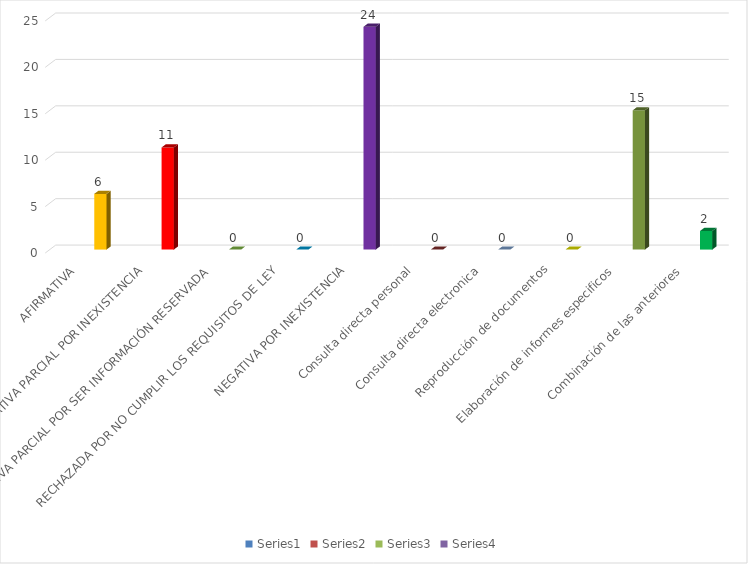
| Category | Series 0 | Series 1 | Series 2 | Series 3 |
|---|---|---|---|---|
| AFIRMATIVA |  |  |  | 6 |
| AFIRMATIVA PARCIAL POR INEXISTENCIA |  |  |  | 11 |
| AFIRMATIVA PARCIAL POR SER INFORMACIÓN RESERVADA |  |  |  | 0 |
| RECHAZADA POR NO CUMPLIR LOS REQUISITOS DE LEY |  |  |  | 0 |
| NEGATIVA POR INEXISTENCIA |  |  |  | 24 |
| Consulta directa personal |  |  |  | 0 |
| Consulta directa electronica |  |  |  | 0 |
| Reproducción de documentos |  |  |  | 0 |
| Elaboración de informes especificos |  |  |  | 15 |
| Combinación de las anteriores |  |  |  | 2 |